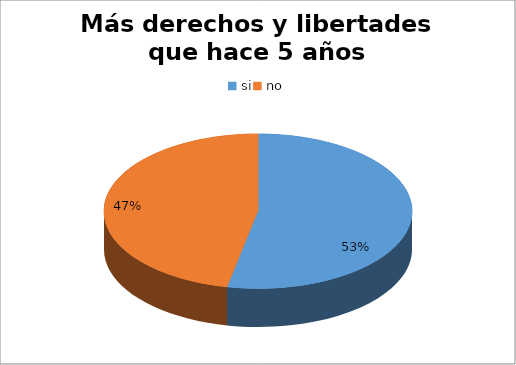
| Category | Series 0 |
|---|---|
| si | 50 |
| no | 44 |